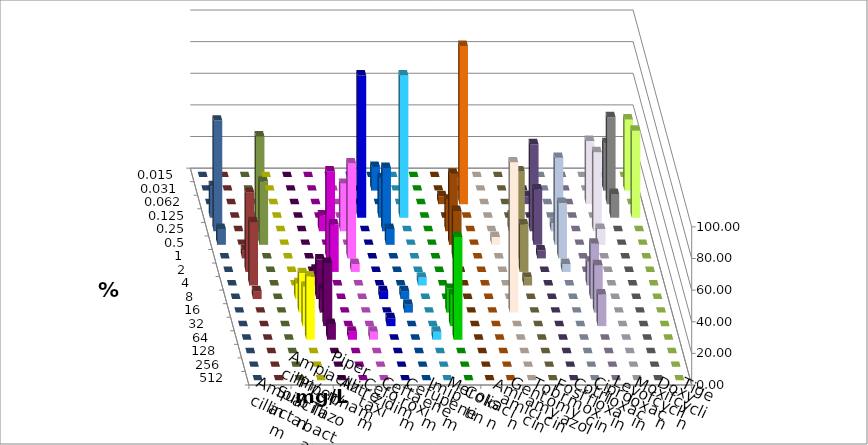
| Category | Ampicillin | Ampicillin/ Sulbactam | Piperacillin | Piperacillin/ Tazobactam | Aztreonam | Cefotaxim | Ceftazidim | Cefuroxim | Imipenem | Meropenem | Colistin | Amikacin | Gentamicin | Tobramycin | Fosfomycin | Cotrimoxazol | Ciprofloxacin | Levofloxacin | Moxifloxacin | Doxycyclin | Tigecyclin |
|---|---|---|---|---|---|---|---|---|---|---|---|---|---|---|---|---|---|---|---|---|---|
| 0.015 | 0 | 0 | 0 | 0 | 0 | 0 | 0 | 0 | 0 | 0 | 0 | 0 | 0 | 0 | 0 | 0 | 0 | 0 | 0 | 0 | 0 |
| 0.031 | 0 | 0 | 0 | 0 | 0 | 15 | 0 | 0 | 0 | 0 | 0 | 0 | 0 | 0 | 0 | 0 | 30 | 45 | 0 | 0 | 0 |
| 0.062 | 0 | 0 | 0 | 0 | 0 | 0 | 0 | 0 | 5 | 100 | 0 | 0 | 5 | 0 | 0 | 40 | 55 | 0 | 0 | 0 | 0 |
| 0.125 | 0 | 0 | 0 | 0 | 90 | 25 | 90 | 0 | 0 | 0 | 0 | 0 | 0 | 0 | 0 | 0 | 15 | 55 | 20 | 0 | 0 |
| 0.25 | 0 | 0 | 10 | 30 | 0 | 40 | 0 | 0 | 20 | 0 | 0 | 10 | 55 | 5 | 0 | 50 | 0 | 0 | 70 | 0 | 60 |
| 0.5 | 0 | 0 | 0 | 0 | 0 | 10 | 0 | 0 | 45 | 0 | 5 | 0 | 35 | 55 | 0 | 10 | 0 | 0 | 10 | 0 | 40 |
| 1.0 | 0 | 0 | 55 | 60 | 0 | 0 | 0 | 0 | 30 | 0 | 0 | 55 | 5 | 35 | 0 | 0 | 0 | 0 | 0 | 5 | 0 |
| 2.0 | 0 | 0 | 30 | 5 | 0 | 0 | 0 | 0 | 0 | 0 | 0 | 30 | 0 | 5 | 0 | 0 | 0 | 0 | 0 | 50 | 0 |
| 4.0 | 0 | 10 | 0 | 0 | 0 | 0 | 5 | 0 | 0 | 0 | 0 | 5 | 0 | 0 | 15 | 0 | 0 | 0 | 0 | 40 | 0 |
| 8.0 | 10 | 25 | 0 | 0 | 5 | 5 | 0 | 0 | 0 | 0 | 0 | 0 | 0 | 0 | 35 | 0 | 0 | 0 | 0 | 5 | 0 |
| 16.0 | 25 | 15 | 0 | 0 | 0 | 5 | 0 | 15 | 0 | 0 | 95 | 0 | 0 | 0 | 30 | 0 | 0 | 0 | 0 | 0 | 0 |
| 32.0 | 25 | 40 | 0 | 0 | 5 | 0 | 0 | 20 | 0 | 0 | 0 | 0 | 0 | 0 | 20 | 0 | 0 | 0 | 0 | 0 | 0 |
| 64.0 | 40 | 10 | 5 | 5 | 0 | 0 | 5 | 65 | 0 | 0 | 0 | 0 | 0 | 0 | 0 | 0 | 0 | 0 | 0 | 0 | 0 |
| 128.0 | 0 | 0 | 0 | 0 | 0 | 0 | 0 | 0 | 0 | 0 | 0 | 0 | 0 | 0 | 0 | 0 | 0 | 0 | 0 | 0 | 0 |
| 256.0 | 0 | 0 | 0 | 0 | 0 | 0 | 0 | 0 | 0 | 0 | 0 | 0 | 0 | 0 | 0 | 0 | 0 | 0 | 0 | 0 | 0 |
| 512.0 | 0 | 0 | 0 | 0 | 0 | 0 | 0 | 0 | 0 | 0 | 0 | 0 | 0 | 0 | 0 | 0 | 0 | 0 | 0 | 0 | 0 |